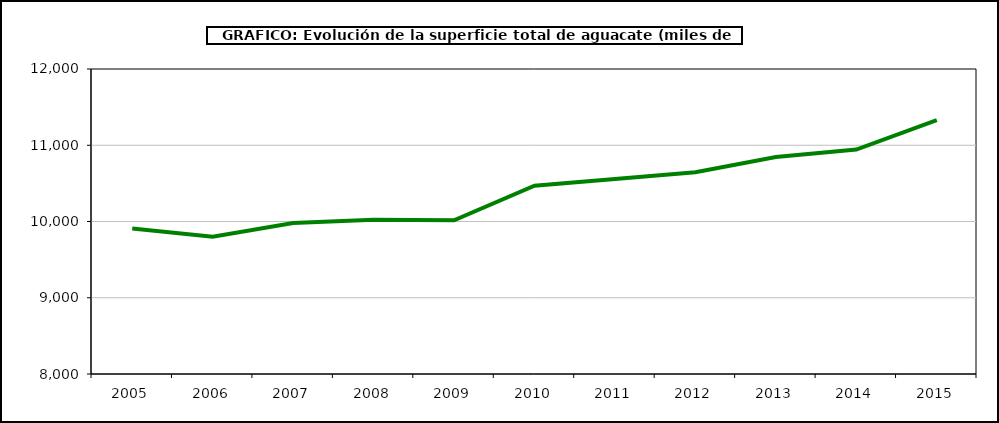
| Category | superficie aguacate |
|---|---|
| 2005.0 | 9907 |
| 2006.0 | 9801 |
| 2007.0 | 9981 |
| 2008.0 | 10023 |
| 2009.0 | 10016 |
| 2010.0 | 10470 |
| 2011.0 | 10558 |
| 2012.0 | 10645 |
| 2013.0 | 10845 |
| 2014.0 | 10943 |
| 2015.0 | 11329 |